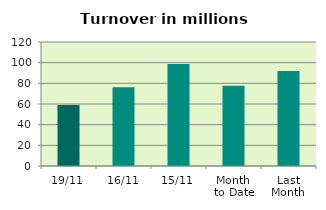
| Category | Series 0 |
|---|---|
| 19/11 | 58.967 |
| 16/11 | 76.195 |
| 15/11 | 98.682 |
| Month 
to Date | 77.742 |
| Last
Month | 91.964 |